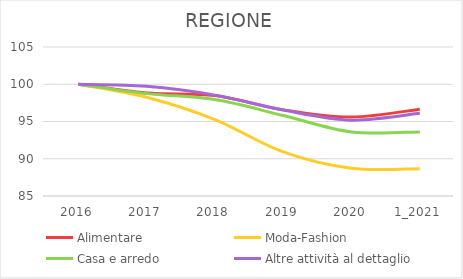
| Category | Alimentare | Moda-Fashion | Casa e arredo | Altre attività al dettaglio |
|---|---|---|---|---|
| 2016 | 100 | 100 | 100 | 100 |
| 2017 | 98.826 | 98.261 | 98.742 | 99.72 |
| 2018 | 98.48 | 95.263 | 97.94 | 98.542 |
| 2019 | 96.564 | 90.924 | 95.801 | 96.545 |
| 2020 | 95.607 | 88.721 | 93.6 | 95.183 |
| 1_2021 | 96.646 | 88.668 | 93.6 | 96.1 |